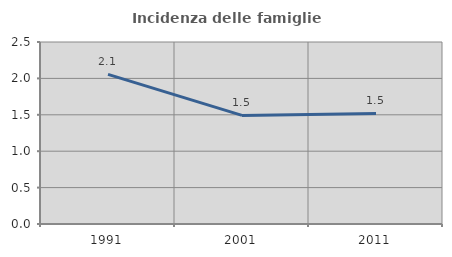
| Category | Incidenza delle famiglie numerose |
|---|---|
| 1991.0 | 2.055 |
| 2001.0 | 1.491 |
| 2011.0 | 1.519 |